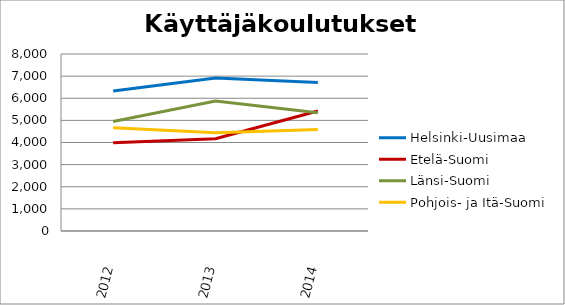
| Category | Helsinki-Uusimaa | Etelä-Suomi | Länsi-Suomi | Pohjois- ja Itä-Suomi |
|---|---|---|---|---|
| 2012.0 | 6324 | 3987 | 4953 | 4666 |
| 2013.0 | 6910 | 4168 | 5878 | 4438 |
| 2014.0 | 6715 | 5421 | 5349 | 4589 |